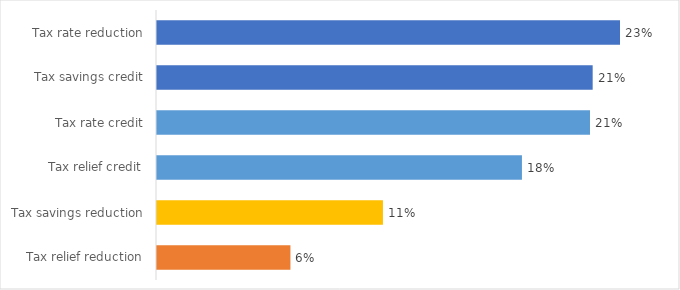
| Category | Series 0 |
|---|---|
| Tax relief reduction | 0.065 |
| Tax savings reduction | 0.11 |
| Tax relief credit | 0.178 |
| Tax rate credit | 0.211 |
| Tax savings credit | 0.212 |
| Tax rate reduction | 0.225 |